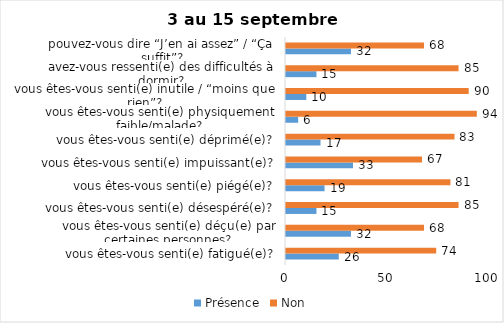
| Category | Présence | Non |
|---|---|---|
| vous êtes-vous senti(e) fatigué(e)? | 26 | 74 |
| vous êtes-vous senti(e) déçu(e) par certaines personnes? | 32 | 68 |
| vous êtes-vous senti(e) désespéré(e)? | 15 | 85 |
| vous êtes-vous senti(e) piégé(e)? | 19 | 81 |
| vous êtes-vous senti(e) impuissant(e)? | 33 | 67 |
| vous êtes-vous senti(e) déprimé(e)? | 17 | 83 |
| vous êtes-vous senti(e) physiquement faible/malade? | 6 | 94 |
| vous êtes-vous senti(e) inutile / “moins que rien”? | 10 | 90 |
| avez-vous ressenti(e) des difficultés à dormir? | 15 | 85 |
| pouvez-vous dire “J’en ai assez” / “Ça suffit”? | 32 | 68 |